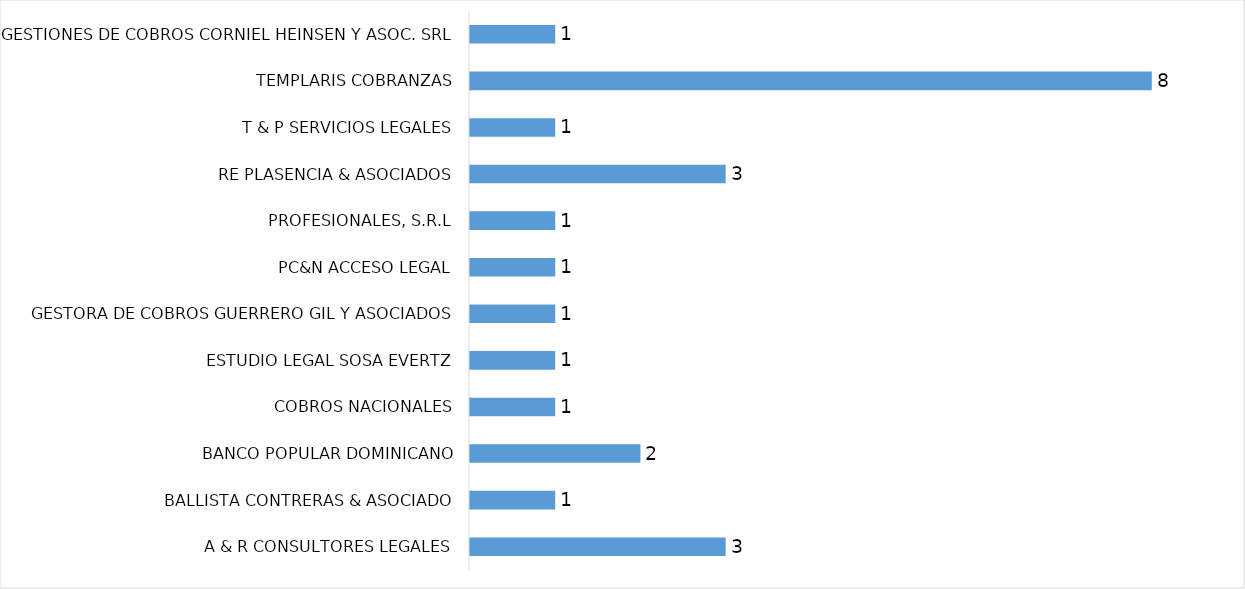
| Category | Series 0 |
|---|---|
| A & R CONSULTORES LEGALES | 3 |
| BALLISTA CONTRERAS & ASOCIADO | 1 |
| BANCO POPULAR DOMINICANO | 2 |
| COBROS NACIONALES | 1 |
| ESTUDIO LEGAL SOSA EVERTZ | 1 |
| GESTORA DE COBROS GUERRERO GIL Y ASOCIADOS | 1 |
| PC&N ACCESO LEGAL | 1 |
| PROFESIONALES, S.R.L | 1 |
| RE PLASENCIA & ASOCIADOS | 3 |
| T & P SERVICIOS LEGALES | 1 |
| TEMPLARIS COBRANZAS | 8 |
| GESTIONES DE COBROS CORNIEL HEINSEN Y ASOC. SRL | 1 |